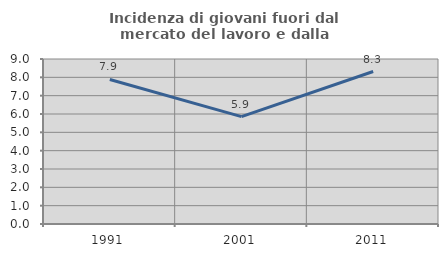
| Category | Incidenza di giovani fuori dal mercato del lavoro e dalla formazione  |
|---|---|
| 1991.0 | 7.884 |
| 2001.0 | 5.857 |
| 2011.0 | 8.318 |